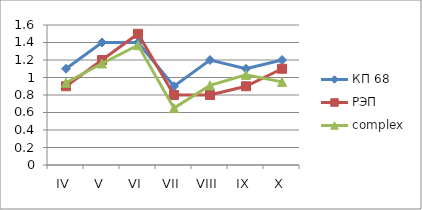
| Category | КП 68 | РЭП  | complex |
|---|---|---|---|
| IV | 1.1 | 0.9 | 0.94 |
| V | 1.4 | 1.2 | 1.16 |
| VI | 1.4 | 1.5 | 1.37 |
| VII | 0.9 | 0.8 | 0.65 |
| VIII | 1.2 | 0.8 | 0.91 |
| IX | 1.1 | 0.9 | 1.03 |
| X | 1.2 | 1.1 | 0.95 |